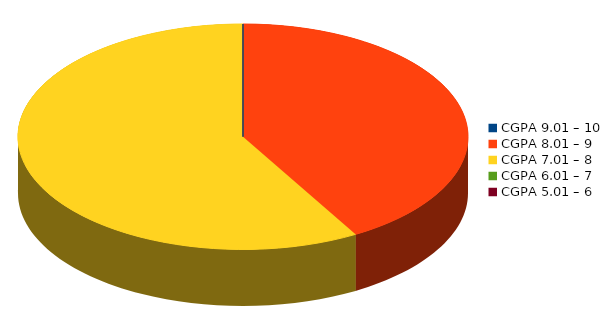
| Category | Number of students |
|---|---|
| CGPA 9.01 – 10 | 0 |
| CGPA 8.01 – 9 | 5 |
| CGPA 7.01 – 8 | 7 |
| CGPA 6.01 – 7 | 0 |
| CGPA 5.01 – 6 | 0 |